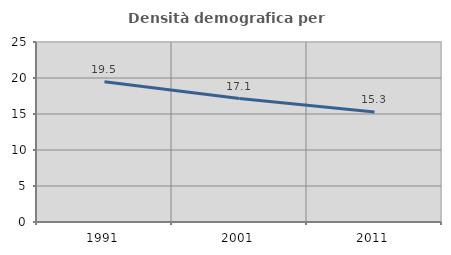
| Category | Densità demografica |
|---|---|
| 1991.0 | 19.485 |
| 2001.0 | 17.138 |
| 2011.0 | 15.284 |